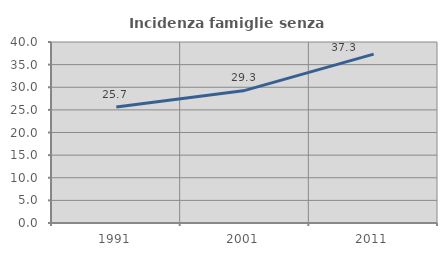
| Category | Incidenza famiglie senza nuclei |
|---|---|
| 1991.0 | 25.655 |
| 2001.0 | 29.305 |
| 2011.0 | 37.316 |